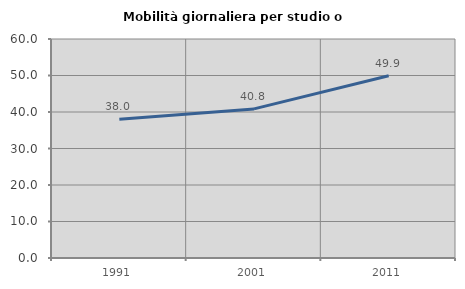
| Category | Mobilità giornaliera per studio o lavoro |
|---|---|
| 1991.0 | 38.005 |
| 2001.0 | 40.846 |
| 2011.0 | 49.944 |